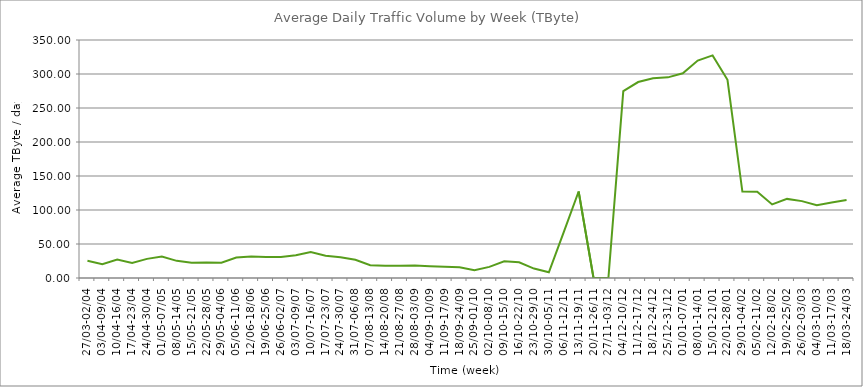
| Category | Average |
|---|---|
| 27/03-02/04 | 25.37 |
| 03/04-09/04 | 20.16 |
| 10/04-16/04 | 27.27 |
| 17/04-23/04 | 22.26 |
| 24/04-30/04 | 28.15 |
| 01/05-07/05 | 31.45 |
| 08/05-14/05 | 25.21 |
| 15/05-21/05 | 22.33 |
| 22/05-28/05 | 22.78 |
| 29/05-04/06 | 22.5 |
| 05/06-11/06 | 30.14 |
| 12/06-18/06 | 31.63 |
| 19/06-25/06 | 31.06 |
| 26/06-02/07 | 30.95 |
| 03/07-09/07 | 33.33 |
| 10/07-16/07 | 38.16 |
| 17/07-23/07 | 32.62 |
| 24/07-30/07 | 30.4 |
| 31/07-06/08 | 26.77 |
| 07/08-13/08 | 18.91 |
| 14/08-20/08 | 18.17 |
| 21/08-27/08 | 17.92 |
| 28/08-03/09 | 18.2 |
| 04/09-10/09 | 17.3 |
| 11/09-17/09 | 16.54 |
| 18/09-24/09 | 15.73 |
| 25/09-01/10 | 11.26 |
| 02/10-08/10 | 16.39 |
| 09/10-15/10 | 24.49 |
| 16/10-22/10 | 23.03 |
| 23/10-29/10 | 13.86 |
| 30/10-05/11 | 8.36 |
| 06/11-12/11 | 67.41 |
| 13/11-19/11 | 127.18 |
| 20/11-26/11 | 0 |
| 27/11-03/12 | 0 |
| 04/12-10/12 | 274.7 |
| 11/12-17/12 | 288.19 |
| 18/12-24/12 | 293.62 |
| 25/12-31/12 | 295.06 |
| 01/01-07/01 | 301.03 |
| 08/01-14/01 | 319.76 |
| 15/01-21/01 | 327.4 |
| 22/01-28/01 | 291.45 |
| 29/01-04/02 | 127.14 |
| 05/02-11/02 | 126.98 |
| 12/02-18/02 | 108.21 |
| 19/02-25/02 | 116.34 |
| 26/02-03/03 | 113.08 |
| 04/03-10/03 | 107.04 |
| 11/03-17/03 | 111.17 |
| 18/03-24/03 | 114.71 |